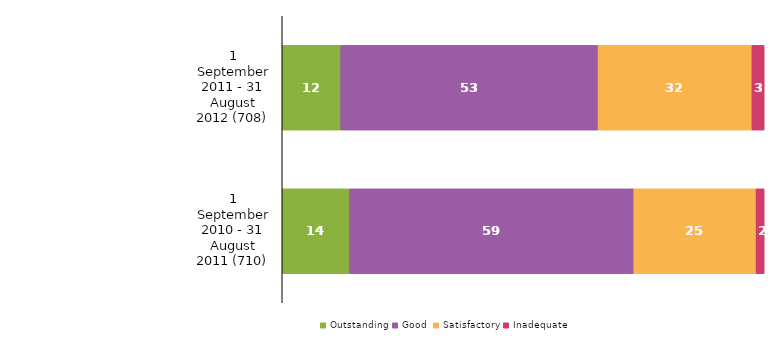
| Category | Outstanding | Good | Satisfactory | Inadequate |
|---|---|---|---|---|
| 1 September 2011 - 31 August 2012 (708) | 12.147 | 53.39 | 31.921 | 2.542 |
| 1 September 2010 - 31 August 2011 (710) | 13.944 | 59.014 | 25.352 | 1.69 |